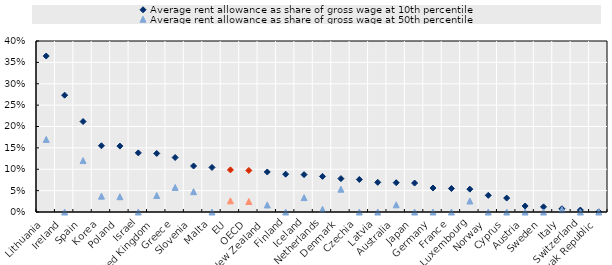
| Category | Average rent allowance as share of gross wage at 10th percentile | Average rent allowance as share of gross wage at 50th percentile |
|---|---|---|
| Lithuania | 0.365 | 0.17 |
| Ireland | 0.273 | 0 |
| Spain | 0.212 | 0.12 |
| Korea | 0.155 | 0.037 |
| Poland | 0.154 | 0.036 |
| Israel | 0.138 | 0 |
| United Kingdom | 0.137 | 0.039 |
| Greece | 0.128 | 0.057 |
| Slovenia | 0.108 | 0.048 |
| Malta | 0.104 | 0 |
| EU | 0.098 | 0.026 |
| OECD | 0.097 | 0.025 |
| New Zealand | 0.094 | 0.016 |
| Finland | 0.088 | 0 |
| Iceland | 0.087 | 0.034 |
| Netherlands | 0.083 | 0.006 |
| Denmark | 0.078 | 0.053 |
| Czechia | 0.076 | 0 |
| Latvia | 0.069 | 0 |
| Australia | 0.069 | 0.017 |
| Japan | 0.068 | 0 |
| Germany | 0.056 | 0 |
| France | 0.055 | 0 |
| Luxembourg | 0.053 | 0.026 |
| Norway | 0.039 | 0 |
| Cyprus | 0.033 | 0 |
| Austria | 0.014 | 0 |
| Sweden | 0.012 | 0 |
| Italy | 0.008 | 0.005 |
| Switzerland | 0.005 | 0 |
| Slovak Republic | 0 | 0 |